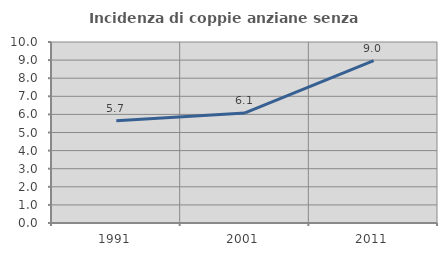
| Category | Incidenza di coppie anziane senza figli  |
|---|---|
| 1991.0 | 5.654 |
| 2001.0 | 6.078 |
| 2011.0 | 8.97 |